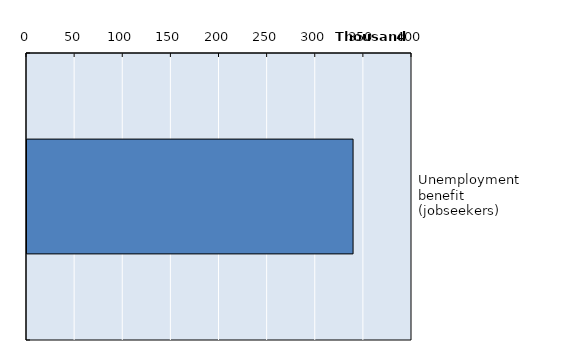
| Category | Series 0 |
|---|---|
| Unemployment benefit (jobseekers) | 338777 |